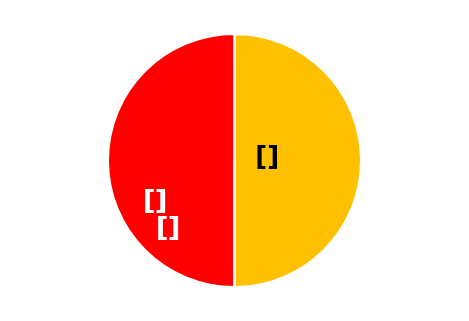
| Category | Series 0 | Series 1 | Series 2 | Series 3 |
|---|---|---|---|---|
| 0 | 30 |  |  | 30 |
| 1 | 0 |  |  | 0 |
| 2 | 30 |  |  | 30 |